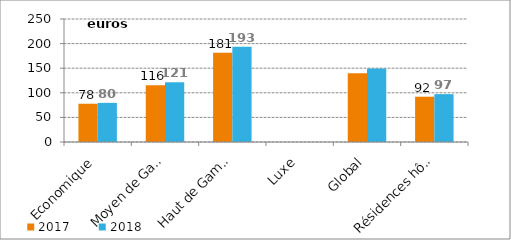
| Category | 2017 | 2018 |
|---|---|---|
| Economique | 77.784 | 79.528 |
| Moyen de Gamme | 115.599 | 121.377 |
| Haut de Gamme | 181.283 | 193.393 |
| Luxe | 0 | 0 |
| Global | 139.896 | 149.553 |
| Résidences hôtelières | 92.071 | 97.28 |